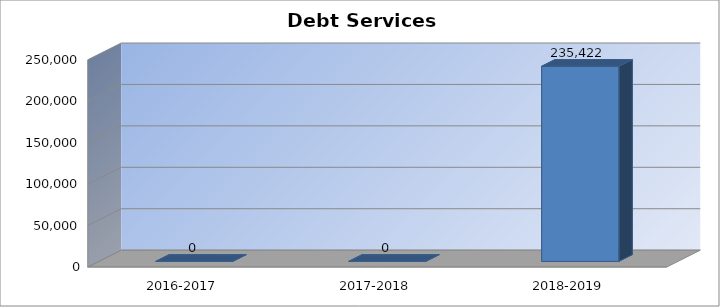
| Category | Debt Services (5100) |
|---|---|
| 2016-2017 | 0 |
| 2017-2018 | 0 |
| 2018-2019 | 235422 |